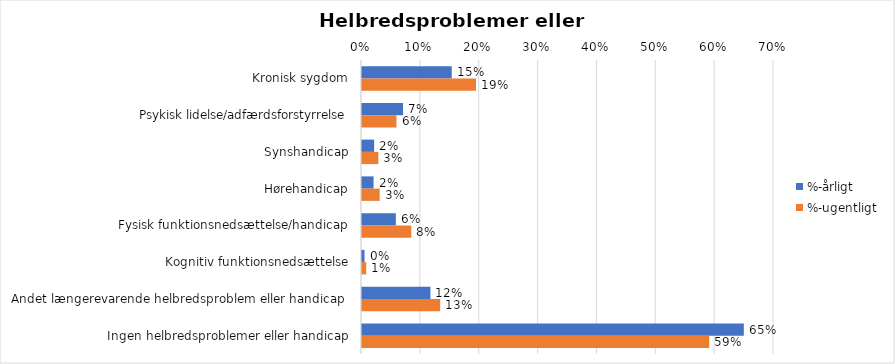
| Category | %-årligt | %-ugentligt |
|---|---|---|
| Kronisk sygdom | 0.152 | 0.194 |
| Psykisk lidelse/adfærdsforstyrrelse | 0.07 | 0.059 |
| Synshandicap | 0.021 | 0.028 |
| Hørehandicap | 0.02 | 0.03 |
| Fysisk funktionsnedsættelse/handicap | 0.058 | 0.084 |
| Kognitiv funktionsnedsættelse | 0.004 | 0.007 |
| Andet længerevarende helbredsproblem eller handicap  | 0.116 | 0.133 |
| Ingen helbredsproblemer eller handicap | 0.649 | 0.59 |